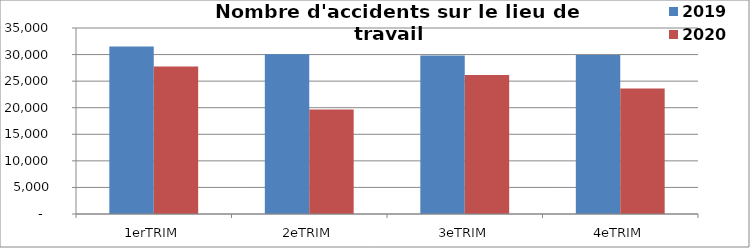
| Category | 2019 | 2020 |
|---|---|---|
| 1erTRIM | 31508 | 27738 |
| 2eTRIM | 30043 | 19664 |
| 3eTRIM | 29807 | 26142 |
| 4eTRIM | 29905 | 23629 |